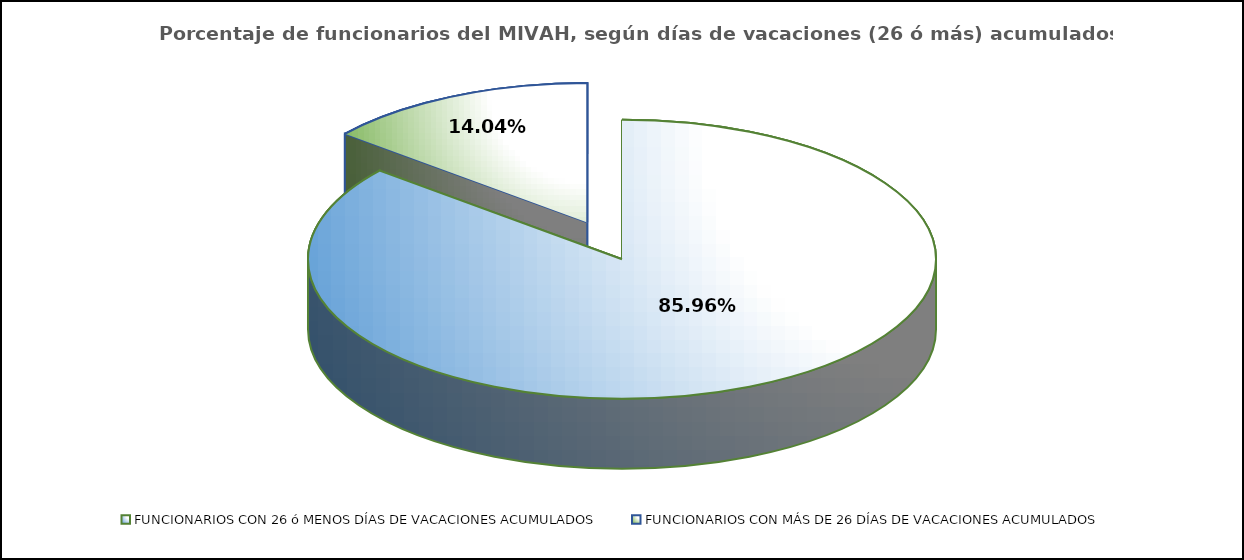
| Category | Series 0 |
|---|---|
| FUNCIONARIOS CON 26 ó MENOS DÍAS DE VACACIONES ACUMULADOS | 0.86 |
| FUNCIONARIOS CON MÁS DE 26 DÍAS DE VACACIONES ACUMULADOS | 0.14 |